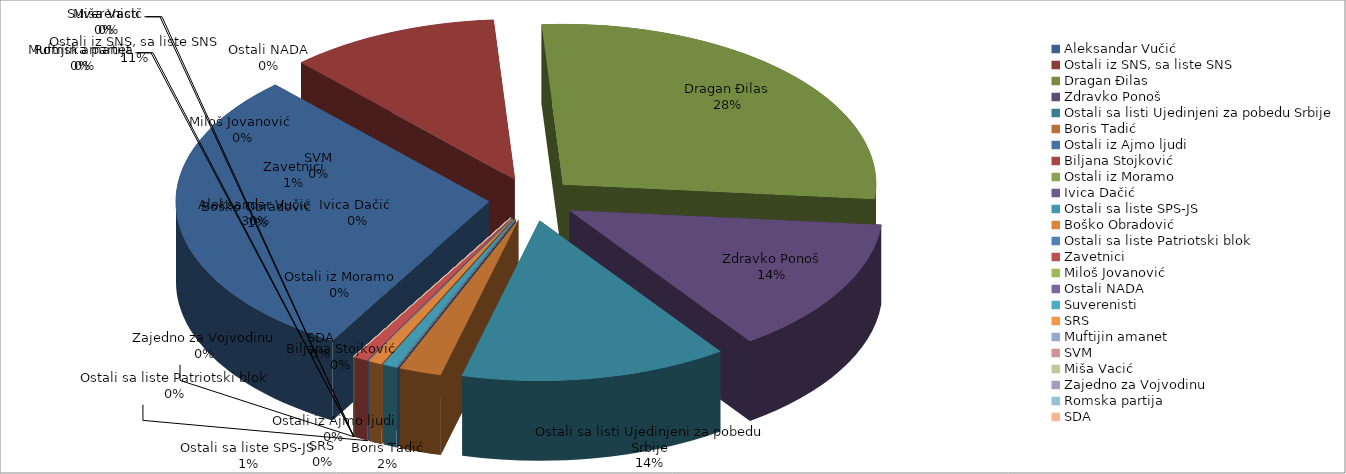
| Category | Series 0 |
|---|---|
| Aleksandar Vučić | 41 |
| Ostali iz SNS, sa liste SNS | 15 |
| Dragan Đilas | 38 |
| Zdravko Ponoš | 19 |
| Ostali sa listi Ujedinjeni za pobedu Srbije | 19 |
| Boris Tadić | 3 |
| Ostali iz Ajmo ljudi | 0 |
| Biljana Stojković | 0 |
| Ostali iz Moramo | 0 |
| Ivica Dačić  | 0 |
| Ostali sa liste SPS-JS | 1 |
| Boško Obradović | 1 |
| Ostali sa liste Patriotski blok | 0 |
| Zavetnici | 1 |
| Miloš Jovanović  | 0 |
| Ostali NADA | 0 |
| Suverenisti | 0 |
| SRS | 0 |
| Muftijin amanet | 0 |
| SVM | 0 |
| Miša Vacić | 0 |
| Zajedno za Vojvodinu | 0 |
| Romska partija | 0 |
| SDA | 0 |